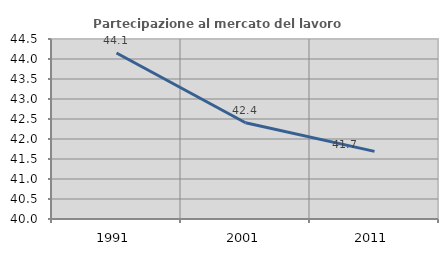
| Category | Partecipazione al mercato del lavoro  femminile |
|---|---|
| 1991.0 | 44.15 |
| 2001.0 | 42.407 |
| 2011.0 | 41.69 |